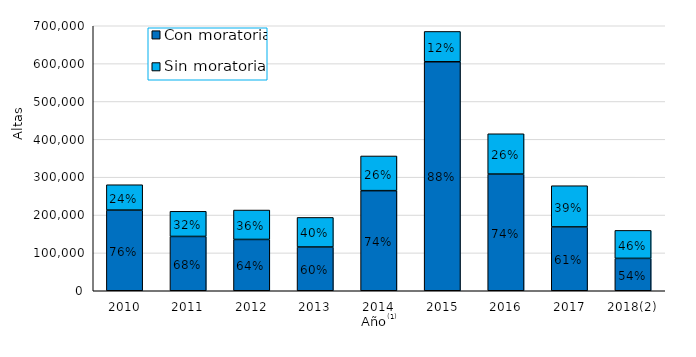
| Category | Con moratoria | Sin moratoria |
|---|---|---|
| 2010 | 213027 | 67045 |
| 2011 | 143456 | 66435 |
| 2012 | 135530 | 77721 |
| 2013 | 115559 | 78177 |
| 2014 | 264405 | 91641 |
| 2015 | 604914 | 80071 |
| 2016 | 308194 | 106505 |
| 2017 | 168592 | 108880 |
| 2018(2) | 85483 | 73997 |